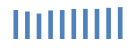
| Category | Exportações (1) |
|---|---|
| 2007.0 | 392293.987 |
| 2008.0 | 370979.678 |
| 2009.0 | 344221.998 |
| 2010.0 | 386156.652 |
| 2011.0 | 390987.572 |